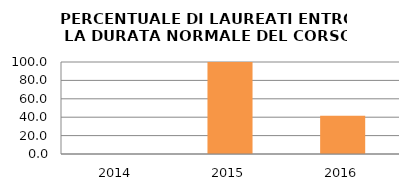
| Category | 2014 2015 2016 |
|---|---|
| 2014.0 | 0 |
| 2015.0 | 100 |
| 2016.0 | 41.667 |